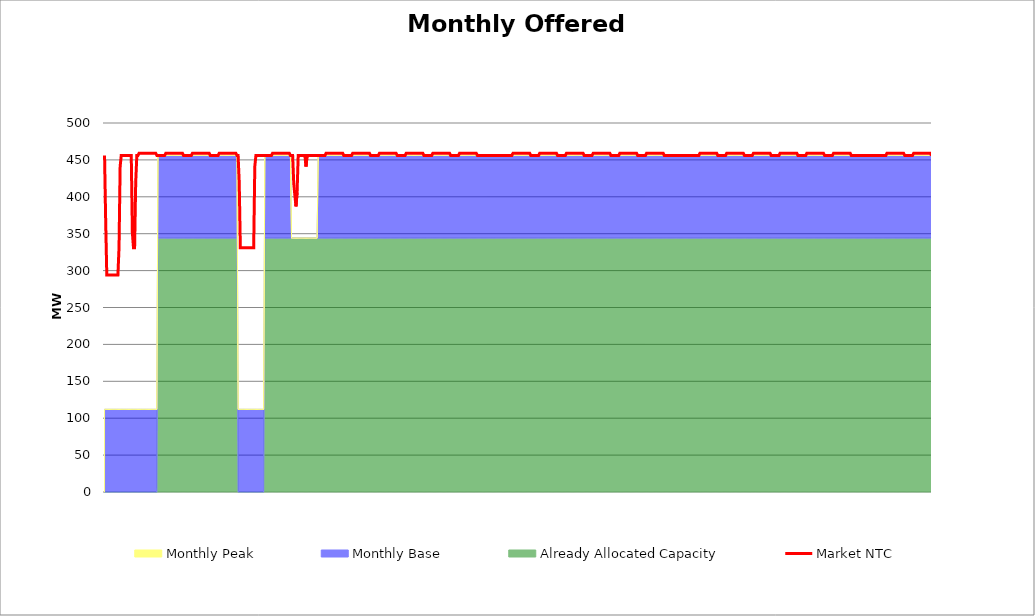
| Category | Market NTC |
|---|---|
| 0 | 456 |
| 1 | 368 |
| 2 | 294 |
| 3 | 294 |
| 4 | 294 |
| 5 | 294 |
| 6 | 294 |
| 7 | 294 |
| 8 | 294 |
| 9 | 294 |
| 10 | 294 |
| 11 | 294 |
| 12 | 294 |
| 13 | 331 |
| 14 | 441 |
| 15 | 456 |
| 16 | 456 |
| 17 | 456 |
| 18 | 456 |
| 19 | 456 |
| 20 | 456 |
| 21 | 456 |
| 22 | 456 |
| 23 | 456 |
| 24 | 456 |
| 25 | 351 |
| 26 | 331 |
| 27 | 331 |
| 28 | 420 |
| 29 | 456 |
| 30 | 456 |
| 31 | 459 |
| 32 | 459 |
| 33 | 459 |
| 34 | 459 |
| 35 | 459 |
| 36 | 459 |
| 37 | 459 |
| 38 | 459 |
| 39 | 459 |
| 40 | 459 |
| 41 | 459 |
| 42 | 459 |
| 43 | 459 |
| 44 | 459 |
| 45 | 459 |
| 46 | 459 |
| 47 | 456 |
| 48 | 456 |
| 49 | 456 |
| 50 | 456 |
| 51 | 456 |
| 52 | 456 |
| 53 | 456 |
| 54 | 456 |
| 55 | 459 |
| 56 | 459 |
| 57 | 459 |
| 58 | 459 |
| 59 | 459 |
| 60 | 459 |
| 61 | 459 |
| 62 | 459 |
| 63 | 459 |
| 64 | 459 |
| 65 | 459 |
| 66 | 459 |
| 67 | 459 |
| 68 | 459 |
| 69 | 459 |
| 70 | 459 |
| 71 | 456 |
| 72 | 456 |
| 73 | 456 |
| 74 | 456 |
| 75 | 456 |
| 76 | 456 |
| 77 | 456 |
| 78 | 456 |
| 79 | 459 |
| 80 | 459 |
| 81 | 459 |
| 82 | 459 |
| 83 | 459 |
| 84 | 459 |
| 85 | 459 |
| 86 | 459 |
| 87 | 459 |
| 88 | 459 |
| 89 | 459 |
| 90 | 459 |
| 91 | 459 |
| 92 | 459 |
| 93 | 459 |
| 94 | 459 |
| 95 | 456 |
| 96 | 456 |
| 97 | 456 |
| 98 | 456 |
| 99 | 456 |
| 100 | 456 |
| 101 | 456 |
| 102 | 456 |
| 103 | 459 |
| 104 | 459 |
| 105 | 459 |
| 106 | 459 |
| 107 | 459 |
| 108 | 459 |
| 109 | 459 |
| 110 | 459 |
| 111 | 459 |
| 112 | 459 |
| 113 | 459 |
| 114 | 459 |
| 115 | 459 |
| 116 | 459 |
| 117 | 459 |
| 118 | 459 |
| 119 | 456 |
| 120 | 456 |
| 121 | 420 |
| 122 | 331 |
| 123 | 331 |
| 124 | 331 |
| 125 | 331 |
| 126 | 331 |
| 127 | 331 |
| 128 | 331 |
| 129 | 331 |
| 130 | 331 |
| 131 | 331 |
| 132 | 331 |
| 133 | 331 |
| 134 | 331 |
| 135 | 441 |
| 136 | 456 |
| 137 | 456 |
| 138 | 456 |
| 139 | 456 |
| 140 | 456 |
| 141 | 456 |
| 142 | 456 |
| 143 | 456 |
| 144 | 456 |
| 145 | 456 |
| 146 | 456 |
| 147 | 456 |
| 148 | 456 |
| 149 | 456 |
| 150 | 456 |
| 151 | 459 |
| 152 | 459 |
| 153 | 459 |
| 154 | 459 |
| 155 | 459 |
| 156 | 459 |
| 157 | 459 |
| 158 | 459 |
| 159 | 459 |
| 160 | 459 |
| 161 | 459 |
| 162 | 459 |
| 163 | 459 |
| 164 | 459 |
| 165 | 459 |
| 166 | 459 |
| 167 | 456 |
| 168 | 456 |
| 169 | 456 |
| 170 | 418 |
| 171 | 402 |
| 172 | 387 |
| 173 | 406 |
| 174 | 456 |
| 175 | 456 |
| 176 | 456 |
| 177 | 456 |
| 178 | 456 |
| 179 | 456 |
| 180 | 456 |
| 181 | 441 |
| 182 | 456 |
| 183 | 456 |
| 184 | 456 |
| 185 | 456 |
| 186 | 456 |
| 187 | 456 |
| 188 | 456 |
| 189 | 456 |
| 190 | 456 |
| 191 | 456 |
| 192 | 456 |
| 193 | 456 |
| 194 | 456 |
| 195 | 456 |
| 196 | 456 |
| 197 | 456 |
| 198 | 456 |
| 199 | 459 |
| 200 | 459 |
| 201 | 459 |
| 202 | 459 |
| 203 | 459 |
| 204 | 459 |
| 205 | 459 |
| 206 | 459 |
| 207 | 459 |
| 208 | 459 |
| 209 | 459 |
| 210 | 459 |
| 211 | 459 |
| 212 | 459 |
| 213 | 459 |
| 214 | 459 |
| 215 | 456 |
| 216 | 456 |
| 217 | 456 |
| 218 | 456 |
| 219 | 456 |
| 220 | 456 |
| 221 | 456 |
| 222 | 456 |
| 223 | 459 |
| 224 | 459 |
| 225 | 459 |
| 226 | 459 |
| 227 | 459 |
| 228 | 459 |
| 229 | 459 |
| 230 | 459 |
| 231 | 459 |
| 232 | 459 |
| 233 | 459 |
| 234 | 459 |
| 235 | 459 |
| 236 | 459 |
| 237 | 459 |
| 238 | 459 |
| 239 | 456 |
| 240 | 456 |
| 241 | 456 |
| 242 | 456 |
| 243 | 456 |
| 244 | 456 |
| 245 | 456 |
| 246 | 456 |
| 247 | 459 |
| 248 | 459 |
| 249 | 459 |
| 250 | 459 |
| 251 | 459 |
| 252 | 459 |
| 253 | 459 |
| 254 | 459 |
| 255 | 459 |
| 256 | 459 |
| 257 | 459 |
| 258 | 459 |
| 259 | 459 |
| 260 | 459 |
| 261 | 459 |
| 262 | 459 |
| 263 | 456 |
| 264 | 456 |
| 265 | 456 |
| 266 | 456 |
| 267 | 456 |
| 268 | 456 |
| 269 | 456 |
| 270 | 456 |
| 271 | 459 |
| 272 | 459 |
| 273 | 459 |
| 274 | 459 |
| 275 | 459 |
| 276 | 459 |
| 277 | 459 |
| 278 | 459 |
| 279 | 459 |
| 280 | 459 |
| 281 | 459 |
| 282 | 459 |
| 283 | 459 |
| 284 | 459 |
| 285 | 459 |
| 286 | 459 |
| 287 | 456 |
| 288 | 456 |
| 289 | 456 |
| 290 | 456 |
| 291 | 456 |
| 292 | 456 |
| 293 | 456 |
| 294 | 456 |
| 295 | 459 |
| 296 | 459 |
| 297 | 459 |
| 298 | 459 |
| 299 | 459 |
| 300 | 459 |
| 301 | 459 |
| 302 | 459 |
| 303 | 459 |
| 304 | 459 |
| 305 | 459 |
| 306 | 459 |
| 307 | 459 |
| 308 | 459 |
| 309 | 459 |
| 310 | 459 |
| 311 | 456 |
| 312 | 456 |
| 313 | 456 |
| 314 | 456 |
| 315 | 456 |
| 316 | 456 |
| 317 | 456 |
| 318 | 456 |
| 319 | 459 |
| 320 | 459 |
| 321 | 459 |
| 322 | 459 |
| 323 | 459 |
| 324 | 459 |
| 325 | 459 |
| 326 | 459 |
| 327 | 459 |
| 328 | 459 |
| 329 | 459 |
| 330 | 459 |
| 331 | 459 |
| 332 | 459 |
| 333 | 459 |
| 334 | 459 |
| 335 | 456 |
| 336 | 456 |
| 337 | 456 |
| 338 | 456 |
| 339 | 456 |
| 340 | 456 |
| 341 | 456 |
| 342 | 456 |
| 343 | 456 |
| 344 | 456 |
| 345 | 456 |
| 346 | 456 |
| 347 | 456 |
| 348 | 456 |
| 349 | 456 |
| 350 | 456 |
| 351 | 456 |
| 352 | 456 |
| 353 | 456 |
| 354 | 456 |
| 355 | 456 |
| 356 | 456 |
| 357 | 456 |
| 358 | 456 |
| 359 | 456 |
| 360 | 456 |
| 361 | 456 |
| 362 | 456 |
| 363 | 456 |
| 364 | 456 |
| 365 | 456 |
| 366 | 456 |
| 367 | 459 |
| 368 | 459 |
| 369 | 459 |
| 370 | 459 |
| 371 | 459 |
| 372 | 459 |
| 373 | 459 |
| 374 | 459 |
| 375 | 459 |
| 376 | 459 |
| 377 | 459 |
| 378 | 459 |
| 379 | 459 |
| 380 | 459 |
| 381 | 459 |
| 382 | 459 |
| 383 | 456 |
| 384 | 456 |
| 385 | 456 |
| 386 | 456 |
| 387 | 456 |
| 388 | 456 |
| 389 | 456 |
| 390 | 456 |
| 391 | 459 |
| 392 | 459 |
| 393 | 459 |
| 394 | 459 |
| 395 | 459 |
| 396 | 459 |
| 397 | 459 |
| 398 | 459 |
| 399 | 459 |
| 400 | 459 |
| 401 | 459 |
| 402 | 459 |
| 403 | 459 |
| 404 | 459 |
| 405 | 459 |
| 406 | 459 |
| 407 | 456 |
| 408 | 456 |
| 409 | 456 |
| 410 | 456 |
| 411 | 456 |
| 412 | 456 |
| 413 | 456 |
| 414 | 456 |
| 415 | 459 |
| 416 | 459 |
| 417 | 459 |
| 418 | 459 |
| 419 | 459 |
| 420 | 459 |
| 421 | 459 |
| 422 | 459 |
| 423 | 459 |
| 424 | 459 |
| 425 | 459 |
| 426 | 459 |
| 427 | 459 |
| 428 | 459 |
| 429 | 459 |
| 430 | 459 |
| 431 | 456 |
| 432 | 456 |
| 433 | 456 |
| 434 | 456 |
| 435 | 456 |
| 436 | 456 |
| 437 | 456 |
| 438 | 456 |
| 439 | 459 |
| 440 | 459 |
| 441 | 459 |
| 442 | 459 |
| 443 | 459 |
| 444 | 459 |
| 445 | 459 |
| 446 | 459 |
| 447 | 459 |
| 448 | 459 |
| 449 | 459 |
| 450 | 459 |
| 451 | 459 |
| 452 | 459 |
| 453 | 459 |
| 454 | 459 |
| 455 | 456 |
| 456 | 456 |
| 457 | 456 |
| 458 | 456 |
| 459 | 456 |
| 460 | 456 |
| 461 | 456 |
| 462 | 456 |
| 463 | 459 |
| 464 | 459 |
| 465 | 459 |
| 466 | 459 |
| 467 | 459 |
| 468 | 459 |
| 469 | 459 |
| 470 | 459 |
| 471 | 459 |
| 472 | 459 |
| 473 | 459 |
| 474 | 459 |
| 475 | 459 |
| 476 | 459 |
| 477 | 459 |
| 478 | 459 |
| 479 | 456 |
| 480 | 456 |
| 481 | 456 |
| 482 | 456 |
| 483 | 456 |
| 484 | 456 |
| 485 | 456 |
| 486 | 456 |
| 487 | 459 |
| 488 | 459 |
| 489 | 459 |
| 490 | 459 |
| 491 | 459 |
| 492 | 459 |
| 493 | 459 |
| 494 | 459 |
| 495 | 459 |
| 496 | 459 |
| 497 | 459 |
| 498 | 459 |
| 499 | 459 |
| 500 | 459 |
| 501 | 459 |
| 502 | 459 |
| 503 | 456 |
| 504 | 456 |
| 505 | 456 |
| 506 | 456 |
| 507 | 456 |
| 508 | 456 |
| 509 | 456 |
| 510 | 456 |
| 511 | 456 |
| 512 | 456 |
| 513 | 456 |
| 514 | 456 |
| 515 | 456 |
| 516 | 456 |
| 517 | 456 |
| 518 | 456 |
| 519 | 456 |
| 520 | 456 |
| 521 | 456 |
| 522 | 456 |
| 523 | 456 |
| 524 | 456 |
| 525 | 456 |
| 526 | 456 |
| 527 | 456 |
| 528 | 456 |
| 529 | 456 |
| 530 | 456 |
| 531 | 456 |
| 532 | 456 |
| 533 | 456 |
| 534 | 456 |
| 535 | 459 |
| 536 | 459 |
| 537 | 459 |
| 538 | 459 |
| 539 | 459 |
| 540 | 459 |
| 541 | 459 |
| 542 | 459 |
| 543 | 459 |
| 544 | 459 |
| 545 | 459 |
| 546 | 459 |
| 547 | 459 |
| 548 | 459 |
| 549 | 459 |
| 550 | 459 |
| 551 | 456 |
| 552 | 456 |
| 553 | 456 |
| 554 | 456 |
| 555 | 456 |
| 556 | 456 |
| 557 | 456 |
| 558 | 456 |
| 559 | 459 |
| 560 | 459 |
| 561 | 459 |
| 562 | 459 |
| 563 | 459 |
| 564 | 459 |
| 565 | 459 |
| 566 | 459 |
| 567 | 459 |
| 568 | 459 |
| 569 | 459 |
| 570 | 459 |
| 571 | 459 |
| 572 | 459 |
| 573 | 459 |
| 574 | 459 |
| 575 | 456 |
| 576 | 456 |
| 577 | 456 |
| 578 | 456 |
| 579 | 456 |
| 580 | 456 |
| 581 | 456 |
| 582 | 456 |
| 583 | 459 |
| 584 | 459 |
| 585 | 459 |
| 586 | 459 |
| 587 | 459 |
| 588 | 459 |
| 589 | 459 |
| 590 | 459 |
| 591 | 459 |
| 592 | 459 |
| 593 | 459 |
| 594 | 459 |
| 595 | 459 |
| 596 | 459 |
| 597 | 459 |
| 598 | 459 |
| 599 | 456 |
| 600 | 456 |
| 601 | 456 |
| 602 | 456 |
| 603 | 456 |
| 604 | 456 |
| 605 | 456 |
| 606 | 456 |
| 607 | 459 |
| 608 | 459 |
| 609 | 459 |
| 610 | 459 |
| 611 | 459 |
| 612 | 459 |
| 613 | 459 |
| 614 | 459 |
| 615 | 459 |
| 616 | 459 |
| 617 | 459 |
| 618 | 459 |
| 619 | 459 |
| 620 | 459 |
| 621 | 459 |
| 622 | 459 |
| 623 | 456 |
| 624 | 456 |
| 625 | 456 |
| 626 | 456 |
| 627 | 456 |
| 628 | 456 |
| 629 | 456 |
| 630 | 456 |
| 631 | 459 |
| 632 | 459 |
| 633 | 459 |
| 634 | 459 |
| 635 | 459 |
| 636 | 459 |
| 637 | 459 |
| 638 | 459 |
| 639 | 459 |
| 640 | 459 |
| 641 | 459 |
| 642 | 459 |
| 643 | 459 |
| 644 | 459 |
| 645 | 459 |
| 646 | 459 |
| 647 | 456 |
| 648 | 456 |
| 649 | 456 |
| 650 | 456 |
| 651 | 456 |
| 652 | 456 |
| 653 | 456 |
| 654 | 456 |
| 655 | 459 |
| 656 | 459 |
| 657 | 459 |
| 658 | 459 |
| 659 | 459 |
| 660 | 459 |
| 661 | 459 |
| 662 | 459 |
| 663 | 459 |
| 664 | 459 |
| 665 | 459 |
| 666 | 459 |
| 667 | 459 |
| 668 | 459 |
| 669 | 459 |
| 670 | 459 |
| 671 | 456 |
| 672 | 456 |
| 673 | 456 |
| 674 | 456 |
| 675 | 456 |
| 676 | 456 |
| 677 | 456 |
| 678 | 456 |
| 679 | 456 |
| 680 | 456 |
| 681 | 456 |
| 682 | 456 |
| 683 | 456 |
| 684 | 456 |
| 685 | 456 |
| 686 | 456 |
| 687 | 456 |
| 688 | 456 |
| 689 | 456 |
| 690 | 456 |
| 691 | 456 |
| 692 | 456 |
| 693 | 456 |
| 694 | 456 |
| 695 | 456 |
| 696 | 456 |
| 697 | 456 |
| 698 | 456 |
| 699 | 456 |
| 700 | 456 |
| 701 | 456 |
| 702 | 456 |
| 703 | 459 |
| 704 | 459 |
| 705 | 459 |
| 706 | 459 |
| 707 | 459 |
| 708 | 459 |
| 709 | 459 |
| 710 | 459 |
| 711 | 459 |
| 712 | 459 |
| 713 | 459 |
| 714 | 459 |
| 715 | 459 |
| 716 | 459 |
| 717 | 459 |
| 718 | 459 |
| 719 | 456 |
| 720 | 456 |
| 721 | 456 |
| 722 | 456 |
| 723 | 456 |
| 724 | 456 |
| 725 | 456 |
| 726 | 456 |
| 727 | 459 |
| 728 | 459 |
| 729 | 459 |
| 730 | 459 |
| 731 | 459 |
| 732 | 459 |
| 733 | 459 |
| 734 | 459 |
| 735 | 459 |
| 736 | 459 |
| 737 | 459 |
| 738 | 459 |
| 739 | 459 |
| 740 | 459 |
| 741 | 459 |
| 742 | 459 |
| 743 | 456 |